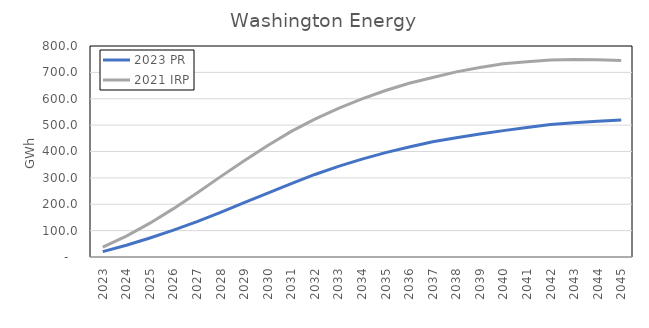
| Category | 2023 PR | 2021 IRP |
|---|---|---|
| 2023.0 | 20.42 | 37.5 |
| 2024.0 | 44.487 | 79.2 |
| 2025.0 | 72.02 | 128.2 |
| 2026.0 | 101.726 | 183.4 |
| 2027.0 | 134.163 | 242.8 |
| 2028.0 | 169.472 | 304.8 |
| 2029.0 | 206.467 | 365.2 |
| 2030.0 | 242.431 | 423.1 |
| 2031.0 | 278.513 | 476.1 |
| 2032.0 | 312.903 | 522.8 |
| 2033.0 | 343.754 | 563.8 |
| 2034.0 | 371.242 | 599.8 |
| 2035.0 | 395.613 | 631.4 |
| 2036.0 | 417.337 | 658.8 |
| 2037.0 | 436.856 | 680.7 |
| 2038.0 | 452.399 | 701.9 |
| 2039.0 | 466.548 | 718.7 |
| 2040.0 | 479.119 | 732.8 |
| 2041.0 | 491.034 | 740.7 |
| 2042.0 | 502.305 | 746.7 |
| 2043.0 | 508.693 | 748.4 |
| 2044.0 | 514.944 | 747.9 |
| 2045.0 | 519.714 | 745.4 |